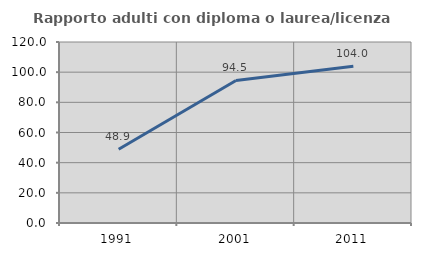
| Category | Rapporto adulti con diploma o laurea/licenza media  |
|---|---|
| 1991.0 | 48.859 |
| 2001.0 | 94.487 |
| 2011.0 | 103.98 |